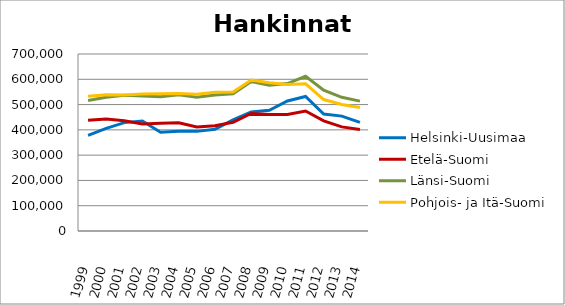
| Category | Helsinki-Uusimaa | Etelä-Suomi | Länsi-Suomi | Pohjois- ja Itä-Suomi |
|---|---|---|---|---|
| 1999.0 | 378452 | 438318 | 516392 | 532828 |
| 2000.0 | 405935 | 442624 | 529062 | 539210 |
| 2001.0 | 428646 | 436162 | 537191 | 537979 |
| 2002.0 | 434775 | 423397 | 534347 | 541733 |
| 2003.0 | 390806 | 425951 | 530715 | 542845 |
| 2004.0 | 394404 | 428337 | 538767 | 544014 |
| 2005.0 | 394032 | 411710 | 529342 | 540443 |
| 2006.0 | 401949 | 415940 | 538195 | 548636 |
| 2007.0 | 439229 | 430086 | 543067 | 550145 |
| 2008.0 | 471093 | 464879 | 591194 | 596960 |
| 2009.0 | 477095 | 460453 | 576517 | 586541 |
| 2010.0 | 514145 | 460373 | 583178 | 578934 |
| 2011.0 | 532003 | 474678 | 612052 | 581939 |
| 2012.0 | 462802 | 435674 | 556879 | 519905 |
| 2013.0 | 454420 | 411823 | 528599 | 500017 |
| 2014.0 | 429367 | 401038 | 513604 | 488319 |